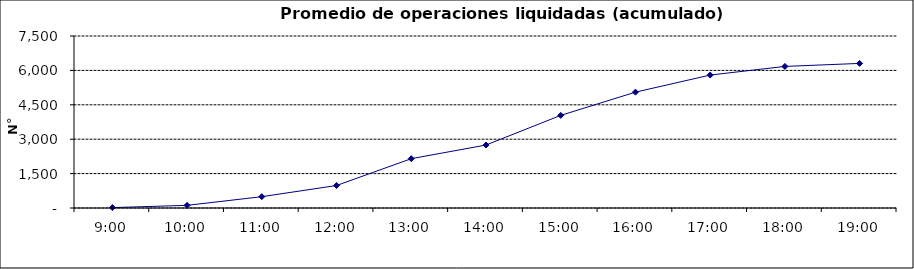
| Category | Promedio Op.Liquidadas (acumulado) |
|---|---|
| 0.375 | 17.524 |
| 0.4166666666666667 | 115.667 |
| 0.4583333333333333 | 493.714 |
| 0.5 | 980.857 |
| 0.5416666666666666 | 2150.571 |
| 0.5833333333333334 | 2746 |
| 0.625 | 4038.238 |
| 0.6666666666666666 | 5051.952 |
| 0.7083333333333334 | 5797.048 |
| 0.75 | 6173.619 |
| 0.7916666666666666 | 6304.667 |